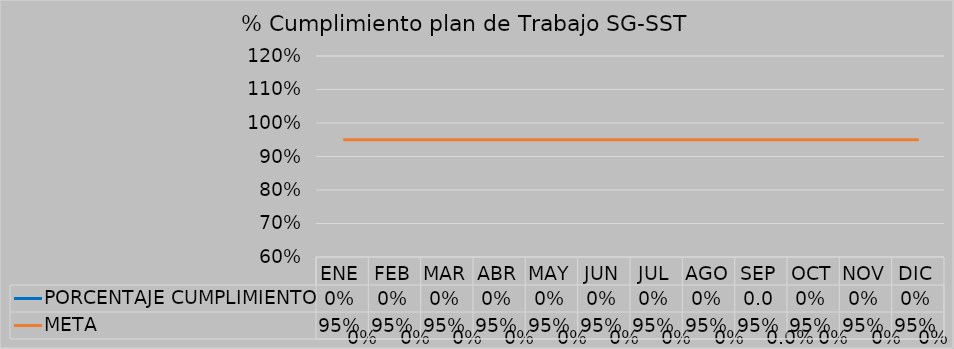
| Category | PORCENTAJE CUMPLIMIENTO | META |
|---|---|---|
| ENE | 0 | 0.95 |
| FEB | 0 | 0.95 |
| MAR | 0 | 0.95 |
| ABR | 0 | 0.95 |
| MAY | 0 | 0.95 |
| JUN | 0 | 0.95 |
| JUL | 0 | 0.95 |
| AGO | 0 | 0.95 |
| SEP | 0 | 0.95 |
| OCT | 0 | 0.95 |
| NOV | 0 | 0.95 |
| DIC | 0 | 0.95 |